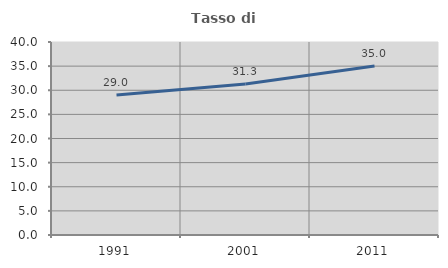
| Category | Tasso di occupazione   |
|---|---|
| 1991.0 | 29.039 |
| 2001.0 | 31.305 |
| 2011.0 | 35.039 |